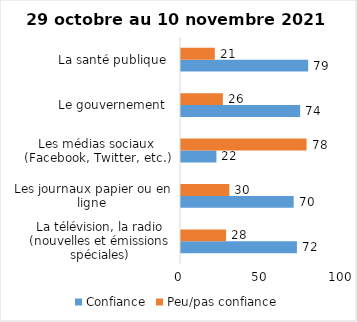
| Category | Confiance | Peu/pas confiance |
|---|---|---|
| La télévision, la radio (nouvelles et émissions spéciales) | 72 | 28 |
| Les journaux papier ou en ligne | 70 | 30 |
| Les médias sociaux (Facebook, Twitter, etc.) | 22 | 78 |
| Le gouvernement  | 74 | 26 |
| La santé publique  | 79 | 21 |